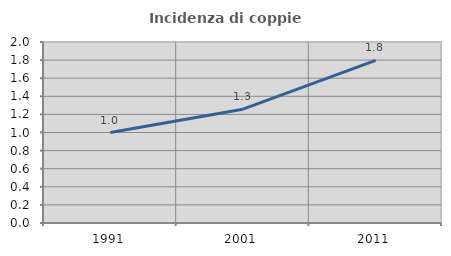
| Category | Incidenza di coppie miste |
|---|---|
| 1991.0 | 1 |
| 2001.0 | 1.258 |
| 2011.0 | 1.796 |